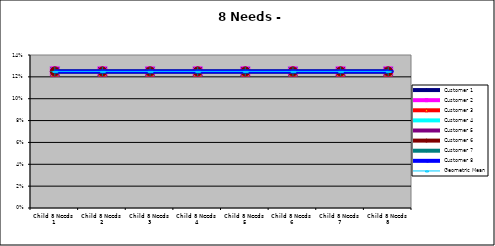
| Category | Customer 1 | Customer 2 | Customer 3 | Customer 4 | Customer 5 | Customer 6 | Customer 7 | Customer 8 | Geometric Mean |
|---|---|---|---|---|---|---|---|---|---|
| Child 8 Needs 1 | 0.125 | 0.125 | 0.125 | 0.125 | 0.125 | 0.125 | 0.125 | 0.125 | 0.125 |
| Child 8 Needs 2 | 0.125 | 0.125 | 0.125 | 0.125 | 0.125 | 0.125 | 0.125 | 0.125 | 0.125 |
| Child 8 Needs 3 | 0.125 | 0.125 | 0.125 | 0.125 | 0.125 | 0.125 | 0.125 | 0.125 | 0.125 |
| Child 8 Needs 4 | 0.125 | 0.125 | 0.125 | 0.125 | 0.125 | 0.125 | 0.125 | 0.125 | 0.125 |
| Child 8 Needs 5 | 0.125 | 0.125 | 0.125 | 0.125 | 0.125 | 0.125 | 0.125 | 0.125 | 0.125 |
| Child 8 Needs 6 | 0.125 | 0.125 | 0.125 | 0.125 | 0.125 | 0.125 | 0.125 | 0.125 | 0.125 |
| Child 8 Needs 7 | 0.125 | 0.125 | 0.125 | 0.125 | 0.125 | 0.125 | 0.125 | 0.125 | 0.125 |
| Child 8 Needs 8 | 0.125 | 0.125 | 0.125 | 0.125 | 0.125 | 0.125 | 0.125 | 0.125 | 0.125 |